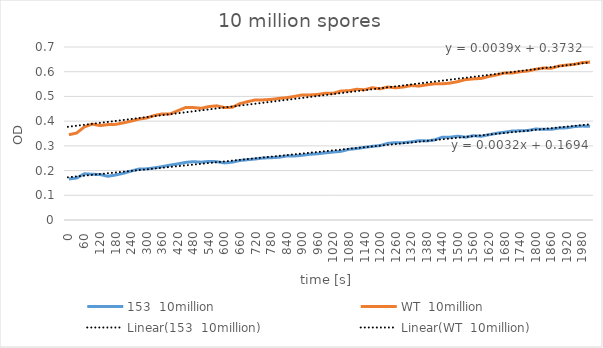
| Category | 153  10million | WT  10million |
|---|---|---|
| 0.0 | 0.166 | 0.345 |
| 30.0 | 0.17 | 0.352 |
| 60.0 | 0.187 | 0.377 |
| 90.0 | 0.185 | 0.388 |
| 120.0 | 0.184 | 0.382 |
| 150.0 | 0.177 | 0.386 |
| 180.0 | 0.182 | 0.387 |
| 210.0 | 0.189 | 0.393 |
| 240.0 | 0.198 | 0.4 |
| 270.0 | 0.206 | 0.408 |
| 300.0 | 0.207 | 0.413 |
| 330.0 | 0.211 | 0.423 |
| 360.0 | 0.216 | 0.429 |
| 390.0 | 0.222 | 0.429 |
| 420.0 | 0.227 | 0.442 |
| 450.0 | 0.233 | 0.455 |
| 480.0 | 0.236 | 0.455 |
| 510.0 | 0.234 | 0.452 |
| 540.0 | 0.237 | 0.459 |
| 570.0 | 0.236 | 0.462 |
| 600.0 | 0.231 | 0.455 |
| 630.0 | 0.234 | 0.456 |
| 660.0 | 0.241 | 0.471 |
| 690.0 | 0.244 | 0.479 |
| 720.0 | 0.247 | 0.486 |
| 750.0 | 0.251 | 0.486 |
| 780.0 | 0.252 | 0.488 |
| 810.0 | 0.254 | 0.492 |
| 840.0 | 0.259 | 0.495 |
| 870.0 | 0.259 | 0.5 |
| 900.0 | 0.262 | 0.506 |
| 930.0 | 0.266 | 0.506 |
| 960.0 | 0.268 | 0.508 |
| 990.0 | 0.272 | 0.513 |
| 1020.0 | 0.275 | 0.513 |
| 1050.0 | 0.278 | 0.522 |
| 1080.0 | 0.286 | 0.523 |
| 1110.0 | 0.289 | 0.529 |
| 1140.0 | 0.294 | 0.527 |
| 1170.0 | 0.298 | 0.535 |
| 1200.0 | 0.301 | 0.531 |
| 1230.0 | 0.31 | 0.538 |
| 1260.0 | 0.313 | 0.535 |
| 1290.0 | 0.313 | 0.538 |
| 1320.0 | 0.316 | 0.544 |
| 1350.0 | 0.321 | 0.542 |
| 1380.0 | 0.32 | 0.547 |
| 1410.0 | 0.324 | 0.551 |
| 1440.0 | 0.335 | 0.551 |
| 1470.0 | 0.335 | 0.554 |
| 1500.0 | 0.339 | 0.56 |
| 1530.0 | 0.335 | 0.568 |
| 1560.0 | 0.341 | 0.571 |
| 1590.0 | 0.339 | 0.573 |
| 1620.0 | 0.345 | 0.581 |
| 1650.0 | 0.351 | 0.587 |
| 1680.0 | 0.355 | 0.595 |
| 1710.0 | 0.36 | 0.595 |
| 1740.0 | 0.361 | 0.6 |
| 1770.0 | 0.362 | 0.603 |
| 1800.0 | 0.368 | 0.61 |
| 1830.0 | 0.367 | 0.615 |
| 1860.0 | 0.367 | 0.614 |
| 1890.0 | 0.372 | 0.623 |
| 1920.0 | 0.373 | 0.627 |
| 1950.0 | 0.378 | 0.63 |
| 1980.0 | 0.38 | 0.637 |
| 2010.0 | 0.379 | 0.639 |